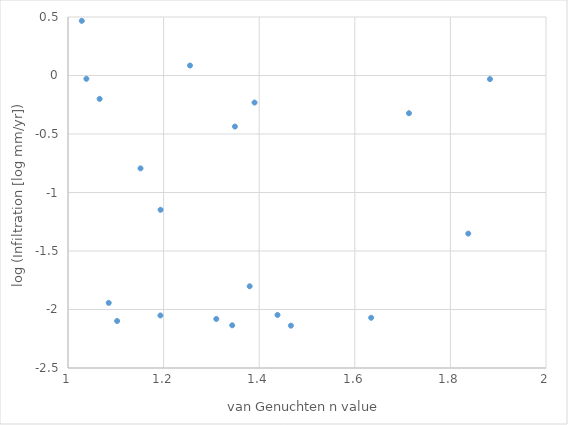
| Category | Series 0 |
|---|---|
| 1.63422634313383 | -2.071 |
| 1.43833259385061 | -2.047 |
| 1.34355516026668 | -2.135 |
| 1.03848855390745 | -0.028 |
| 1.02888748081717 | 0.467 |
| 1.08520824448538 | -1.944 |
| 1.3800396235689 | -1.802 |
| 1.10274006615567 | -2.098 |
| 1.8373739132495 | -1.351 |
| 1.31023516994858 | -2.081 |
| 1.88276690114764 | -0.031 |
| 1.39025518162195 | -0.231 |
| 1.19330882937748 | -2.051 |
| 1.34919788483777 | -0.437 |
| 1.19367517350398 | -1.148 |
| 1.71335387954856 | -0.323 |
| 1.06616011291022 | -0.2 |
| 1.46629479367782 | -2.138 |
| 1.15167711412776 | -0.794 |
| 1.25523827759084 | 0.085 |